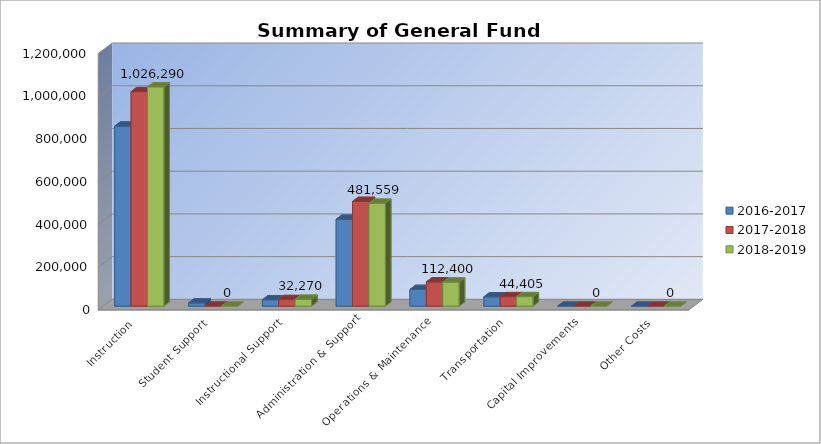
| Category | 2016-2017 | 2017-2018 | 2018-2019 |
|---|---|---|---|
| Instruction | 842653 | 1003999 | 1026290 |
| Student Support | 14713 | 0 | 0 |
| Instructional Support | 29852 | 30705 | 32270 |
| Administration & Support | 406576 | 490048 | 481559 |
| Operations & Maintenance | 78211 | 113317 | 112400 |
| Transportation | 43399 | 44314 | 44405 |
| Capital Improvements | 0 | 0 | 0 |
| Other Costs | 0 | 0 | 0 |